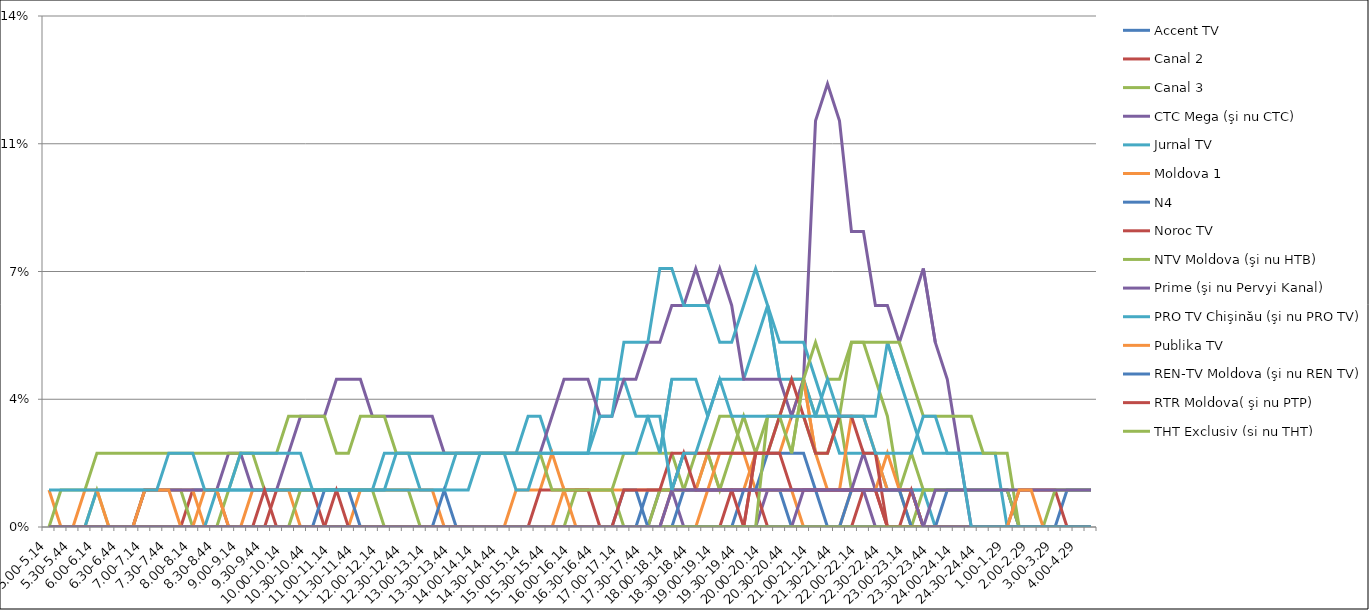
| Category | Accent TV | Canal 2 | Canal 3 | CTC Mega (şi nu CTC) | Jurnal TV | Moldova 1 | N4 | Noroc TV | NTV Moldova (şi nu HTB) | Prime (şi nu Pervyi Kanal) | PRO TV Chişinău (şi nu PRO TV) | Publika TV  | REN-TV Moldova (şi nu REN TV)  | RTR Moldova( şi nu PTP)  | THT Exclusiv (şi nu THT) | TV8 | TVC 21 | TVR MOLDOVA (şi nu TVR) | Canal Regional | Familia Domashniy | ITV | Moldova 2 | Alt canal |
|---|---|---|---|---|---|---|---|---|---|---|---|---|---|---|---|---|---|---|---|---|---|---|---|
| 5.00-5.14 | 0 | 0 | 0 | 0 | 0 | 0 | 0 | 0 | 0 | 0 | 0 | 0.01 | 0 | 0 | 0 | 0 | 0 | 0 | 0 | 0 | 0 | 0 | 0.01 |
| 5.15-5.29 | 0 | 0 | 0 | 0 | 0 | 0 | 0 | 0 | 0 | 0 | 0 | 0 | 0 | 0 | 0.01 | 0 | 0 | 0 | 0 | 0 | 0 | 0 | 0.01 |
| 5.30-5.44 | 0 | 0 | 0 | 0 | 0 | 0 | 0 | 0 | 0 | 0 | 0 | 0 | 0 | 0 | 0.01 | 0 | 0 | 0 | 0 | 0 | 0 | 0 | 0.01 |
| 5.45-5.59 | 0 | 0 | 0 | 0 | 0 | 0 | 0 | 0 | 0 | 0 | 0 | 0.01 | 0 | 0 | 0.01 | 0 | 0 | 0 | 0 | 0 | 0 | 0 | 0.01 |
| 6.00-6.14 | 0 | 0 | 0.01 | 0 | 0.01 | 0 | 0 | 0 | 0 | 0 | 0 | 0.01 | 0 | 0 | 0.02 | 0 | 0 | 0 | 0 | 0 | 0 | 0 | 0.01 |
| 6.15-6.29 | 0 | 0 | 0 | 0 | 0.01 | 0 | 0 | 0 | 0 | 0 | 0 | 0 | 0 | 0 | 0.02 | 0 | 0 | 0 | 0 | 0 | 0 | 0 | 0.01 |
| 6.30-6.44 | 0 | 0 | 0 | 0 | 0.01 | 0 | 0 | 0 | 0 | 0 | 0 | 0 | 0 | 0 | 0.02 | 0 | 0 | 0 | 0 | 0 | 0 | 0 | 0.01 |
| 6.45-6.59 | 0 | 0 | 0 | 0 | 0.01 | 0 | 0 | 0 | 0 | 0 | 0 | 0 | 0 | 0 | 0.02 | 0 | 0 | 0 | 0 | 0 | 0 | 0 | 0.01 |
| 7.00-7.14 | 0 | 0 | 0.01 | 0 | 0.01 | 0.01 | 0 | 0 | 0 | 0.01 | 0 | 0.01 | 0 | 0 | 0.02 | 0 | 0 | 0 | 0 | 0 | 0 | 0 | 0.01 |
| 7.15-7.29 | 0 | 0 | 0.01 | 0 | 0.01 | 0.01 | 0 | 0 | 0 | 0.01 | 0 | 0.01 | 0 | 0 | 0.02 | 0 | 0 | 0 | 0 | 0 | 0 | 0 | 0.01 |
| 7.30-7.44 | 0 | 0 | 0.01 | 0 | 0.01 | 0.01 | 0 | 0 | 0 | 0.01 | 0 | 0.01 | 0 | 0 | 0.02 | 0 | 0 | 0 | 0 | 0 | 0 | 0 | 0.02 |
| 7.45-7.59 | 0 | 0 | 0.01 | 0 | 0.01 | 0.01 | 0 | 0 | 0 | 0.01 | 0 | 0 | 0 | 0 | 0.02 | 0 | 0 | 0 | 0 | 0 | 0 | 0 | 0.02 |
| 8.00-8.14 | 0 | 0.01 | 0 | 0 | 0.01 | 0.01 | 0 | 0 | 0 | 0.01 | 0 | 0 | 0 | 0 | 0.02 | 0 | 0 | 0 | 0 | 0 | 0 | 0 | 0.02 |
| 8.15-8.29 | 0 | 0.01 | 0 | 0 | 0.01 | 0 | 0 | 0 | 0 | 0.01 | 0 | 0.01 | 0 | 0 | 0.02 | 0 | 0 | 0 | 0 | 0 | 0 | 0 | 0.01 |
| 8.30-8.44 | 0 | 0.01 | 0 | 0 | 0.01 | 0 | 0 | 0 | 0 | 0.01 | 0.01 | 0.01 | 0 | 0 | 0.02 | 0 | 0 | 0 | 0 | 0 | 0 | 0 | 0.01 |
| 8.45-8.59 | 0 | 0 | 0.01 | 0 | 0.01 | 0 | 0 | 0 | 0 | 0.02 | 0.01 | 0 | 0 | 0 | 0.02 | 0 | 0 | 0 | 0 | 0 | 0 | 0 | 0.01 |
| 9.00-9.14 | 0 | 0 | 0.02 | 0 | 0.01 | 0 | 0 | 0 | 0 | 0.02 | 0.01 | 0 | 0 | 0 | 0.02 | 0 | 0 | 0 | 0 | 0 | 0 | 0 | 0.02 |
| 9.15-9.29 | 0 | 0 | 0.02 | 0 | 0.01 | 0.01 | 0 | 0 | 0 | 0.01 | 0.01 | 0 | 0 | 0 | 0.02 | 0 | 0 | 0 | 0 | 0 | 0 | 0 | 0.02 |
| 9.30-9.44 | 0 | 0 | 0.01 | 0 | 0.01 | 0.01 | 0 | 0 | 0 | 0.01 | 0.01 | 0 | 0 | 0.01 | 0.02 | 0 | 0 | 0 | 0 | 0 | 0 | 0 | 0.02 |
| 9.45-9.59 | 0 | 0.01 | 0.01 | 0 | 0.01 | 0.01 | 0 | 0 | 0 | 0.01 | 0.01 | 0 | 0 | 0 | 0.02 | 0 | 0 | 0 | 0 | 0 | 0 | 0 | 0.02 |
| 10.00-10.14 | 0 | 0.01 | 0.01 | 0 | 0.01 | 0.01 | 0 | 0 | 0 | 0.02 | 0.01 | 0 | 0 | 0 | 0.03 | 0 | 0 | 0 | 0 | 0 | 0 | 0 | 0.02 |
| 10.15-10.29 | 0 | 0.01 | 0.01 | 0 | 0.01 | 0 | 0 | 0 | 0.01 | 0.03 | 0.01 | 0 | 0 | 0 | 0.03 | 0 | 0 | 0 | 0 | 0 | 0 | 0 | 0.02 |
| 10.30-10.44 | 0 | 0.01 | 0.01 | 0 | 0.01 | 0 | 0 | 0 | 0.01 | 0.03 | 0.01 | 0 | 0 | 0 | 0.03 | 0 | 0 | 0 | 0 | 0 | 0 | 0 | 0.01 |
| 10.45-10.59 | 0 | 0 | 0.01 | 0 | 0.01 | 0 | 0.01 | 0 | 0.01 | 0.03 | 0.01 | 0 | 0 | 0 | 0.03 | 0 | 0 | 0 | 0 | 0 | 0 | 0 | 0.01 |
| 11.00-11.14 | 0 | 0 | 0.01 | 0 | 0.01 | 0 | 0.01 | 0 | 0.01 | 0.04 | 0.01 | 0 | 0 | 0.01 | 0.02 | 0 | 0 | 0 | 0 | 0 | 0 | 0 | 0.01 |
| 11.15-11.29 | 0 | 0 | 0.01 | 0 | 0.01 | 0 | 0.01 | 0 | 0.01 | 0.04 | 0.01 | 0 | 0 | 0 | 0.02 | 0 | 0 | 0 | 0 | 0 | 0 | 0 | 0.01 |
| 11.30-11.44 | 0 | 0 | 0.01 | 0 | 0.01 | 0.01 | 0 | 0 | 0.01 | 0.04 | 0.01 | 0 | 0 | 0 | 0.03 | 0 | 0 | 0 | 0 | 0 | 0 | 0 | 0.01 |
| 11.45-11.59 | 0 | 0 | 0.01 | 0 | 0.01 | 0.01 | 0 | 0 | 0.01 | 0.03 | 0.01 | 0 | 0 | 0 | 0.03 | 0 | 0 | 0 | 0 | 0 | 0 | 0 | 0.01 |
| 12.00-12.14 | 0 | 0 | 0.01 | 0 | 0.02 | 0.01 | 0 | 0 | 0 | 0.03 | 0.01 | 0 | 0 | 0 | 0.03 | 0 | 0 | 0 | 0 | 0 | 0 | 0 | 0.01 |
| 12.15-12.29 | 0 | 0 | 0.01 | 0 | 0.02 | 0.01 | 0 | 0 | 0 | 0.03 | 0.01 | 0 | 0 | 0 | 0.02 | 0 | 0 | 0 | 0 | 0 | 0 | 0 | 0.02 |
| 12.30-12.44 | 0 | 0 | 0.01 | 0 | 0.02 | 0.01 | 0 | 0 | 0 | 0.03 | 0.01 | 0 | 0 | 0 | 0.02 | 0 | 0 | 0 | 0 | 0 | 0 | 0 | 0.02 |
| 12.45-12.59 | 0 | 0 | 0 | 0 | 0.01 | 0.01 | 0 | 0 | 0 | 0.03 | 0.01 | 0 | 0 | 0 | 0.02 | 0 | 0 | 0 | 0 | 0 | 0 | 0 | 0.02 |
| 13.00-13.14 | 0 | 0 | 0 | 0 | 0.01 | 0.01 | 0 | 0 | 0 | 0.03 | 0.01 | 0 | 0 | 0 | 0.02 | 0 | 0 | 0 | 0 | 0 | 0 | 0 | 0.02 |
| 13.15-13.29 | 0 | 0 | 0 | 0 | 0.01 | 0 | 0.01 | 0 | 0 | 0.02 | 0.01 | 0 | 0 | 0 | 0.02 | 0 | 0 | 0 | 0 | 0 | 0 | 0 | 0.02 |
| 13.30-13.44 | 0 | 0 | 0 | 0 | 0.02 | 0 | 0 | 0 | 0 | 0.02 | 0.01 | 0 | 0 | 0 | 0.02 | 0 | 0 | 0 | 0 | 0 | 0 | 0 | 0.02 |
| 13.45-13.59 | 0 | 0 | 0 | 0 | 0.02 | 0 | 0 | 0 | 0 | 0.02 | 0.01 | 0 | 0 | 0 | 0.02 | 0 | 0 | 0 | 0 | 0 | 0 | 0 | 0.02 |
| 14.00-14.14 | 0 | 0 | 0 | 0 | 0.02 | 0 | 0 | 0 | 0 | 0.02 | 0.02 | 0 | 0 | 0 | 0.02 | 0 | 0 | 0 | 0 | 0 | 0 | 0 | 0.02 |
| 14.15-14.29 | 0 | 0 | 0 | 0 | 0.02 | 0 | 0 | 0 | 0 | 0.02 | 0.02 | 0 | 0 | 0 | 0.02 | 0 | 0 | 0 | 0 | 0 | 0 | 0 | 0.02 |
| 14.30-14.44 | 0 | 0 | 0 | 0 | 0.02 | 0 | 0 | 0 | 0 | 0.02 | 0.02 | 0 | 0 | 0 | 0.02 | 0 | 0 | 0 | 0 | 0 | 0 | 0 | 0.02 |
| 14.45-14.59 | 0 | 0 | 0 | 0 | 0.02 | 0.01 | 0 | 0 | 0 | 0.02 | 0.01 | 0 | 0 | 0 | 0.02 | 0 | 0 | 0 | 0 | 0 | 0 | 0 | 0.02 |
| 15.00-15.14 | 0 | 0 | 0 | 0 | 0.03 | 0.01 | 0 | 0 | 0 | 0.02 | 0.01 | 0 | 0 | 0 | 0.02 | 0 | 0 | 0 | 0 | 0 | 0 | 0 | 0.02 |
| 15.15-15.29 | 0 | 0 | 0 | 0 | 0.03 | 0.01 | 0 | 0.01 | 0 | 0.02 | 0.02 | 0 | 0 | 0 | 0.02 | 0 | 0 | 0 | 0 | 0 | 0 | 0 | 0.02 |
| 15.30-15.44 | 0 | 0 | 0 | 0 | 0.02 | 0.02 | 0 | 0.01 | 0 | 0.03 | 0.02 | 0 | 0 | 0 | 0.01 | 0 | 0 | 0 | 0 | 0 | 0 | 0 | 0.02 |
| 15.45-15.59 | 0 | 0 | 0 | 0 | 0.02 | 0.01 | 0 | 0.01 | 0 | 0.04 | 0.02 | 0.01 | 0 | 0 | 0.01 | 0 | 0 | 0 | 0 | 0 | 0 | 0 | 0.02 |
| 16.00-16.14 | 0 | 0 | 0.01 | 0 | 0.02 | 0.01 | 0 | 0.01 | 0 | 0.04 | 0.02 | 0 | 0 | 0 | 0.01 | 0 | 0 | 0 | 0 | 0 | 0 | 0 | 0.02 |
| 16.15-16.29 | 0 | 0 | 0.01 | 0 | 0.02 | 0.01 | 0 | 0.01 | 0 | 0.04 | 0.02 | 0 | 0 | 0 | 0.01 | 0 | 0 | 0 | 0 | 0 | 0 | 0 | 0.02 |
| 16.30-16.44 | 0 | 0 | 0.01 | 0 | 0.04 | 0.01 | 0 | 0 | 0 | 0.03 | 0.03 | 0 | 0 | 0 | 0.01 | 0 | 0 | 0 | 0 | 0 | 0 | 0 | 0.02 |
| 16.45-16.59 | 0 | 0 | 0.01 | 0 | 0.04 | 0.01 | 0 | 0 | 0 | 0.03 | 0.03 | 0 | 0 | 0 | 0.01 | 0 | 0 | 0 | 0 | 0 | 0 | 0 | 0.02 |
| 17.00-17.14 | 0 | 0 | 0.02 | 0 | 0.04 | 0.01 | 0 | 0 | 0 | 0.04 | 0.051 | 0 | 0.01 | 0 | 0 | 0 | 0 | 0 | 0 | 0.01 | 0 | 0 | 0.02 |
| 17.15-17.29 | 0 | 0 | 0.02 | 0 | 0.03 | 0.01 | 0 | 0 | 0 | 0.04 | 0.051 | 0 | 0.01 | 0 | 0 | 0 | 0 | 0 | 0 | 0.01 | 0 | 0 | 0.02 |
| 17.30-17.44 | 0.01 | 0 | 0.02 | 0 | 0.03 | 0.01 | 0 | 0 | 0 | 0.051 | 0.051 | 0 | 0 | 0 | 0 | 0 | 0 | 0 | 0 | 0.01 | 0 | 0 | 0.03 |
| 17.45-17.59 | 0.01 | 0 | 0.02 | 0.01 | 0.02 | 0.01 | 0 | 0 | 0.01 | 0.051 | 0.071 | 0 | 0 | 0 | 0 | 0 | 0 | 0 | 0 | 0.01 | 0 | 0 | 0.03 |
| 18.00-18.14 | 0.01 | 0 | 0.02 | 0.01 | 0.04 | 0.01 | 0 | 0 | 0.01 | 0.061 | 0.071 | 0 | 0 | 0.01 | 0 | 0 | 0 | 0 | 0 | 0.02 | 0 | 0.01 | 0.01 |
| 18.15-18.29 | 0.01 | 0 | 0.01 | 0 | 0.04 | 0.01 | 0.01 | 0 | 0.01 | 0.061 | 0.061 | 0 | 0 | 0.02 | 0 | 0 | 0 | 0 | 0 | 0.02 | 0 | 0.01 | 0.02 |
| 18.30-18.44 | 0.01 | 0 | 0.01 | 0 | 0.04 | 0.01 | 0.01 | 0 | 0.02 | 0.071 | 0.061 | 0 | 0 | 0.01 | 0 | 0 | 0 | 0 | 0 | 0.02 | 0 | 0.01 | 0.02 |
| 18.45-18.59 | 0.01 | 0 | 0.02 | 0 | 0.03 | 0.02 | 0.01 | 0 | 0.02 | 0.061 | 0.061 | 0.01 | 0 | 0.01 | 0 | 0 | 0 | 0 | 0 | 0.02 | 0 | 0.01 | 0.03 |
| 19.00-19.14 | 0.01 | 0 | 0.03 | 0 | 0.04 | 0.01 | 0.01 | 0 | 0.01 | 0.071 | 0.051 | 0.02 | 0 | 0.01 | 0 | 0 | 0 | 0 | 0 | 0.02 | 0 | 0.01 | 0.04 |
| 19.15-19.29 | 0.01 | 0 | 0.03 | 0 | 0.04 | 0.01 | 0.01 | 0.01 | 0.02 | 0.061 | 0.051 | 0.02 | 0 | 0.01 | 0 | 0 | 0 | 0 | 0 | 0.02 | 0 | 0.01 | 0.03 |
| 19.30-19.44 | 0.01 | 0 | 0.02 | 0 | 0.04 | 0.01 | 0.01 | 0.01 | 0.03 | 0.04 | 0.061 | 0.02 | 0.01 | 0 | 0 | 0 | 0 | 0 | 0 | 0.02 | 0 | 0.01 | 0.03 |
| 19.45-19.59 | 0.01 | 0 | 0.02 | 0 | 0.051 | 0.02 | 0.01 | 0.01 | 0.02 | 0.04 | 0.071 | 0.01 | 0.01 | 0.02 | 0 | 0 | 0 | 0 | 0 | 0.02 | 0 | 0.01 | 0.03 |
| 20.00-20.14 | 0.01 | 0 | 0.02 | 0.01 | 0.061 | 0.02 | 0.01 | 0 | 0.03 | 0.04 | 0.061 | 0.01 | 0.02 | 0.02 | 0.03 | 0 | 0 | 0 | 0 | 0.02 | 0 | 0.01 | 0.03 |
| 20.15-20.29 | 0.01 | 0 | 0.03 | 0.01 | 0.04 | 0.02 | 0.01 | 0 | 0.03 | 0.04 | 0.051 | 0.01 | 0.02 | 0.03 | 0.03 | 0 | 0 | 0 | 0 | 0.02 | 0 | 0.01 | 0.03 |
| 20.30-20.44 | 0.01 | 0 | 0.04 | 0.01 | 0.04 | 0.03 | 0 | 0 | 0.03 | 0.03 | 0.051 | 0.01 | 0.02 | 0.04 | 0.02 | 0 | 0 | 0 | 0 | 0.01 | 0 | 0.01 | 0.03 |
| 20.45-20.59 | 0.01 | 0 | 0.04 | 0.01 | 0.04 | 0.04 | 0 | 0 | 0.03 | 0.04 | 0.051 | 0 | 0.02 | 0.03 | 0.04 | 0.01 | 0 | 0 | 0 | 0.01 | 0 | 0.01 | 0.03 |
| 21.00-21.14 | 0.01 | 0 | 0.03 | 0.01 | 0.03 | 0.02 | 0 | 0 | 0.02 | 0.111 | 0.04 | 0 | 0.01 | 0.02 | 0.051 | 0.01 | 0 | 0 | 0 | 0.01 | 0 | 0.01 | 0.03 |
| 21.15-21.29 | 0.01 | 0 | 0.03 | 0.01 | 0.03 | 0.01 | 0 | 0 | 0.02 | 0.121 | 0.03 | 0 | 0 | 0.02 | 0.04 | 0.01 | 0 | 0 | 0 | 0.01 | 0 | 0.01 | 0.04 |
| 21.30-21.44 | 0.01 | 0 | 0.03 | 0.01 | 0.02 | 0.01 | 0 | 0 | 0.03 | 0.111 | 0.03 | 0 | 0 | 0.03 | 0.04 | 0.01 | 0 | 0 | 0 | 0.01 | 0 | 0.01 | 0.03 |
| 21.45-21.59 | 0.01 | 0 | 0.01 | 0.01 | 0.02 | 0.03 | 0 | 0 | 0.051 | 0.081 | 0.03 | 0.01 | 0.01 | 0.03 | 0.051 | 0.01 | 0 | 0 | 0 | 0.01 | 0 | 0.01 | 0.03 |
| 22.00-22.14 | 0.01 | 0.01 | 0.01 | 0.02 | 0.02 | 0.03 | 0 | 0 | 0.051 | 0.081 | 0.03 | 0.01 | 0.01 | 0.02 | 0.051 | 0.01 | 0 | 0 | 0 | 0.01 | 0 | 0.01 | 0.03 |
| 22.15-22.29 | 0.01 | 0.01 | 0.01 | 0.01 | 0.02 | 0.02 | 0 | 0 | 0.04 | 0.061 | 0.03 | 0.01 | 0.01 | 0.02 | 0.051 | 0 | 0 | 0 | 0 | 0.01 | 0 | 0.01 | 0.02 |
| 22.30-22.44 | 0.01 | 0 | 0.01 | 0.01 | 0.01 | 0.01 | 0 | 0 | 0.03 | 0.061 | 0.051 | 0.02 | 0.01 | 0 | 0.051 | 0 | 0 | 0 | 0 | 0 | 0 | 0.01 | 0.02 |
| 22.45-22.59 | 0.01 | 0 | 0.01 | 0.01 | 0.01 | 0.01 | 0 | 0 | 0.01 | 0.051 | 0.04 | 0.01 | 0.01 | 0 | 0.051 | 0 | 0 | 0 | 0 | 0 | 0 | 0.01 | 0.02 |
| 23.00-23.14 | 0.01 | 0 | 0.02 | 0.01 | 0.01 | 0.01 | 0 | 0 | 0 | 0.061 | 0.03 | 0.01 | 0 | 0.01 | 0.04 | 0 | 0 | 0 | 0 | 0 | 0 | 0.01 | 0.02 |
| 23.15-23.29 | 0.01 | 0 | 0.01 | 0 | 0.01 | 0 | 0 | 0 | 0.01 | 0.071 | 0.02 | 0 | 0 | 0 | 0.03 | 0 | 0 | 0 | 0 | 0 | 0 | 0 | 0.03 |
| 23.30-23.44 | 0.01 | 0 | 0.01 | 0 | 0 | 0 | 0 | 0 | 0.01 | 0.051 | 0.02 | 0 | 0 | 0 | 0.03 | 0.01 | 0 | 0 | 0 | 0 | 0 | 0 | 0.03 |
| 23.45-23.59 | 0.01 | 0 | 0.01 | 0 | 0 | 0 | 0.01 | 0 | 0.01 | 0.04 | 0.02 | 0 | 0 | 0 | 0.03 | 0.01 | 0 | 0 | 0 | 0 | 0 | 0 | 0.02 |
| 24.00-24.14 | 0.01 | 0 | 0.01 | 0 | 0 | 0 | 0.01 | 0 | 0.01 | 0.02 | 0.02 | 0 | 0 | 0 | 0.03 | 0.01 | 0 | 0 | 0 | 0 | 0 | 0 | 0.02 |
| 24.15-24.29 | 0.01 | 0 | 0.01 | 0 | 0 | 0 | 0.01 | 0 | 0.01 | 0 | 0.02 | 0 | 0 | 0 | 0.03 | 0.01 | 0 | 0 | 0 | 0 | 0 | 0 | 0 |
| 24.30-24.44 | 0.01 | 0 | 0.01 | 0 | 0 | 0 | 0.01 | 0 | 0.01 | 0 | 0.02 | 0 | 0 | 0 | 0.02 | 0.01 | 0 | 0 | 0 | 0 | 0 | 0 | 0 |
| 24.45-24.59 | 0.01 | 0 | 0.01 | 0 | 0 | 0 | 0.01 | 0 | 0.01 | 0 | 0.02 | 0 | 0 | 0 | 0.02 | 0.01 | 0 | 0 | 0 | 0 | 0 | 0 | 0 |
| 1.00-1.29 | 0.01 | 0 | 0.01 | 0 | 0 | 0 | 0.01 | 0 | 0.01 | 0 | 0 | 0 | 0 | 0 | 0.02 | 0.01 | 0 | 0 | 0 | 0 | 0 | 0 | 0 |
| 1.30-1. 59 | 0 | 0 | 0.01 | 0 | 0 | 0 | 0 | 0.01 | 0 | 0 | 0 | 0 | 0 | 0 | 0 | 0.01 | 0 | 0.01 | 0 | 0 | 0 | 0 | 0 |
| 2.00-2.29 | 0 | 0 | 0.01 | 0 | 0 | 0 | 0 | 0.01 | 0 | 0 | 0 | 0 | 0 | 0 | 0 | 0.01 | 0 | 0.01 | 0 | 0 | 0 | 0 | 0 |
| 2.30-2.59 | 0 | 0 | 0.01 | 0 | 0 | 0 | 0 | 0.01 | 0 | 0 | 0 | 0 | 0 | 0 | 0 | 0.01 | 0 | 0 | 0 | 0 | 0 | 0 | 0 |
| 3.00-3.29 | 0 | 0 | 0.01 | 0 | 0 | 0 | 0 | 0.01 | 0 | 0 | 0 | 0 | 0 | 0 | 0.01 | 0.01 | 0 | 0 | 0 | 0 | 0 | 0 | 0 |
| 3.30-3.59 | 0 | 0 | 0.01 | 0 | 0 | 0 | 0.01 | 0 | 0 | 0 | 0 | 0 | 0 | 0 | 0.01 | 0.01 | 0 | 0 | 0 | 0 | 0 | 0 | 0 |
| 4.00-4.29 | 0 | 0 | 0.01 | 0 | 0 | 0 | 0.01 | 0 | 0 | 0 | 0 | 0 | 0 | 0 | 0.01 | 0.01 | 0 | 0 | 0 | 0 | 0 | 0 | 0 |
| 4.30-4.59 | 0 | 0 | 0.01 | 0 | 0 | 0 | 0.01 | 0 | 0 | 0 | 0 | 0 | 0 | 0 | 0.01 | 0.01 | 0 | 0 | 0 | 0 | 0 | 0 | 0 |